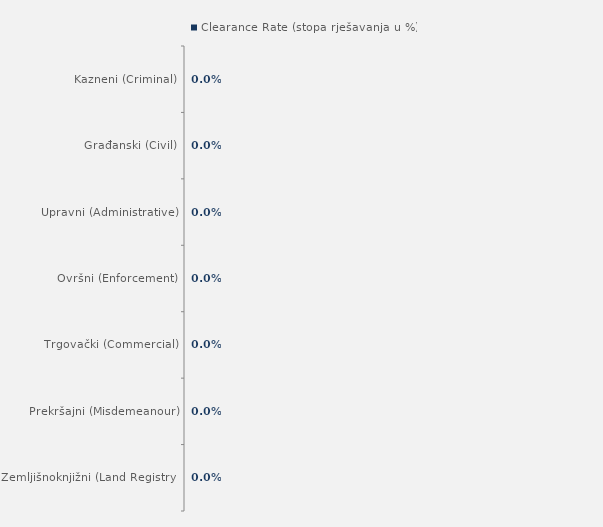
| Category | Clearance Rate (stopa rješavanja u %) |
|---|---|
| Kazneni (Criminal) | 0.966 |
| Građanski (Civil) | 1.038 |
| Upravni (Administrative) | 1.112 |
| Ovršni (Enforcement) | 0.854 |
| Trgovački (Commercial) | 1.088 |
| Prekršajni (Misdemeanour) | 1.209 |
| Zemljišnoknjižni (Land Registry) | 1.036 |